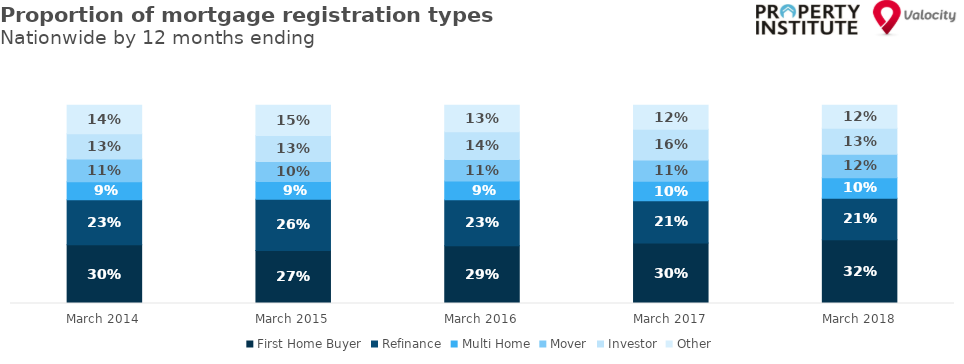
| Category | First Home Buyer | Refinance | Multi Home | Mover | Investor | Other |
|---|---|---|---|---|---|---|
| 2014-03-01 | 0.297 | 0.226 | 0.092 | 0.114 | 0.127 | 0.144 |
| 2015-03-01 | 0.268 | 0.258 | 0.09 | 0.101 | 0.132 | 0.152 |
| 2016-03-01 | 0.291 | 0.231 | 0.095 | 0.108 | 0.141 | 0.134 |
| 2017-03-01 | 0.305 | 0.213 | 0.098 | 0.108 | 0.155 | 0.121 |
| 2018-03-01 | 0.322 | 0.209 | 0.104 | 0.118 | 0.132 | 0.116 |